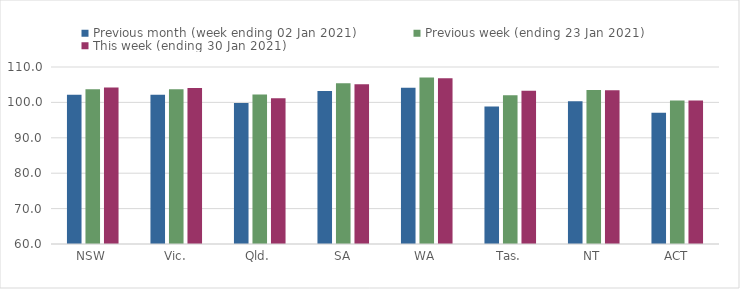
| Category | Previous month (week ending 02 Jan 2021) | Previous week (ending 23 Jan 2021) | This week (ending 30 Jan 2021) |
|---|---|---|---|
| NSW | 102.18 | 103.71 | 104.22 |
| Vic. | 102.14 | 103.68 | 104.07 |
| Qld. | 99.83 | 102.2 | 101.17 |
| SA | 103.21 | 105.38 | 105.14 |
| WA | 104.14 | 107.04 | 106.83 |
| Tas. | 98.87 | 102.04 | 103.29 |
| NT | 100.33 | 103.51 | 103.44 |
| ACT | 97.09 | 100.52 | 100.53 |